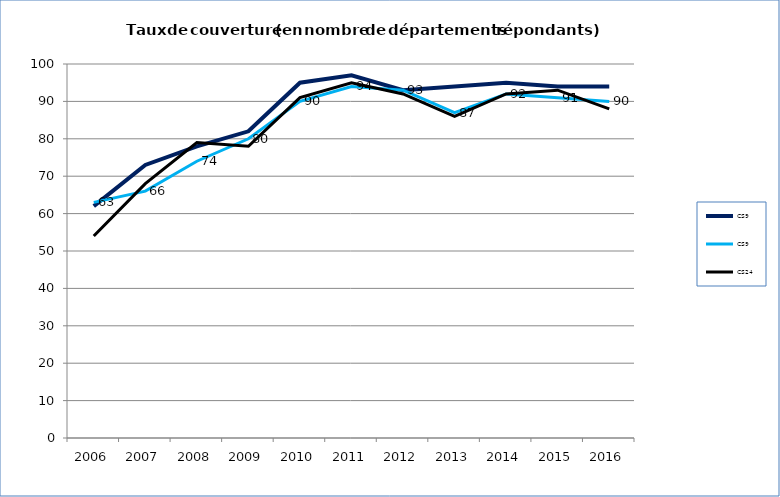
| Category | CS9 | CS24 |
|---|---|---|
| 2006.0 | 63 | 54 |
| 2007.0 | 66 | 68 |
| 2008.0 | 74 | 79 |
| 2009.0 | 80 | 78 |
| 2010.0 | 90 | 91 |
| 2011.0 | 94 | 95 |
| 2012.0 | 93 | 92 |
| 2013.0 | 87 | 86 |
| 2014.0 | 92 | 92 |
| 2015.0 | 91 | 93 |
| 2016.0 | 90 | 88 |